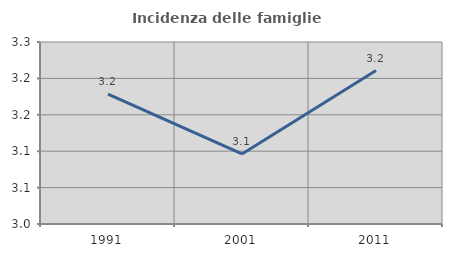
| Category | Incidenza delle famiglie numerose |
|---|---|
| 1991.0 | 3.178 |
| 2001.0 | 3.096 |
| 2011.0 | 3.211 |